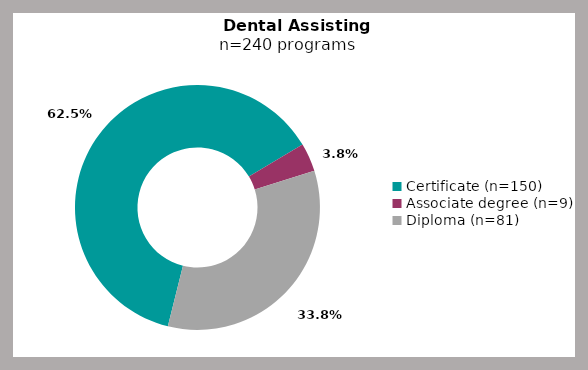
| Category | Series 0 |
|---|---|
| Certificate (n=150) | 0.625 |
| Associate degree (n=9) | 0.038 |
| Diploma (n=81) | 0.338 |